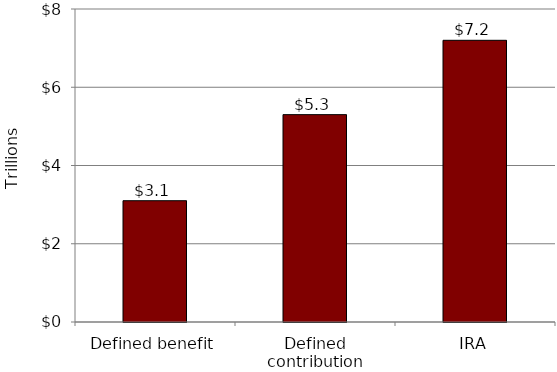
| Category | Series 0 |
|---|---|
| Defined benefit | 3.1 |
| Defined contribution | 5.3 |
| IRA | 7.2 |